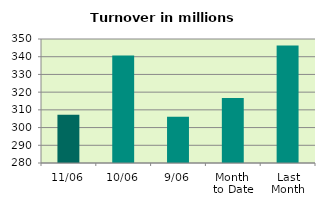
| Category | Series 0 |
|---|---|
| 11/06 | 307.282 |
| 10/06 | 340.696 |
| 9/06 | 306.089 |
| Month 
to Date | 316.688 |
| Last
Month | 346.329 |